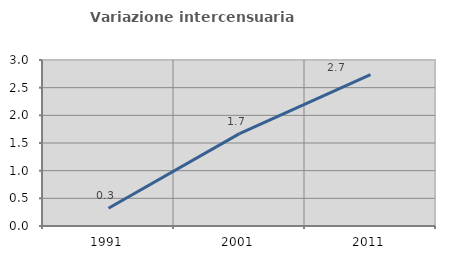
| Category | Variazione intercensuaria annua |
|---|---|
| 1991.0 | 0.32 |
| 2001.0 | 1.669 |
| 2011.0 | 2.738 |